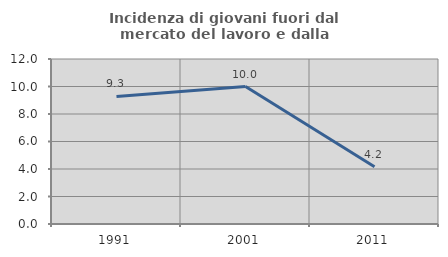
| Category | Incidenza di giovani fuori dal mercato del lavoro e dalla formazione  |
|---|---|
| 1991.0 | 9.278 |
| 2001.0 | 10 |
| 2011.0 | 4.167 |